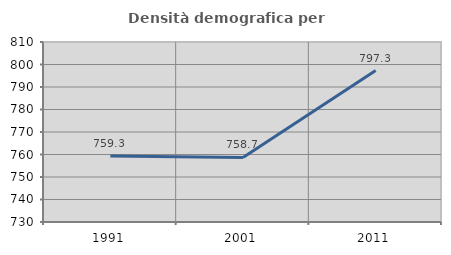
| Category | Densità demografica |
|---|---|
| 1991.0 | 759.284 |
| 2001.0 | 758.719 |
| 2011.0 | 797.319 |